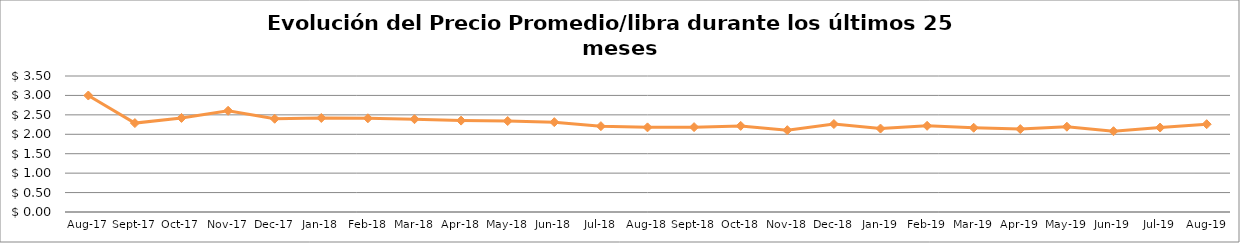
| Category | Series 0 |
|---|---|
| 2017-08-01 | 2.997 |
| 2017-09-01 | 2.288 |
| 2017-10-01 | 2.421 |
| 2017-11-01 | 2.605 |
| 2017-12-01 | 2.4 |
| 2018-01-01 | 2.42 |
| 2018-02-01 | 2.412 |
| 2018-03-01 | 2.388 |
| 2018-04-01 | 2.352 |
| 2018-05-01 | 2.341 |
| 2018-06-01 | 2.312 |
| 2018-07-01 | 2.209 |
| 2018-08-01 | 2.178 |
| 2018-09-01 | 2.184 |
| 2018-10-01 | 2.216 |
| 2018-11-01 | 2.106 |
| 2018-12-01 | 2.264 |
| 2019-01-01 | 2.147 |
| 2019-02-01 | 2.218 |
| 2019-03-01 | 2.169 |
| 2019-04-01 | 2.134 |
| 2019-05-01 | 2.195 |
| 2019-06-01 | 2.079 |
| 2019-07-01 | 2.173 |
| 2019-08-01 | 2.26 |